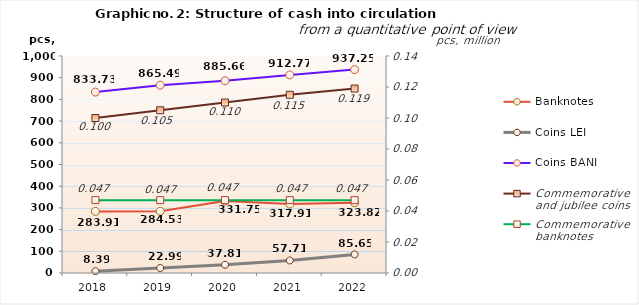
| Category | Banknotes | Coins LEI | Coins BANI |
|---|---|---|---|
| 2018 | 283.91 | 8.39 | 833.73 |
| 2019 | 284.53 | 22.99 | 865.49 |
| 2020 | 331.75 | 37.81 | 885.66 |
| 2021 | 317.91 | 57.71 | 912.77 |
| 2022 | 323.82 | 85.65 | 937.25 |